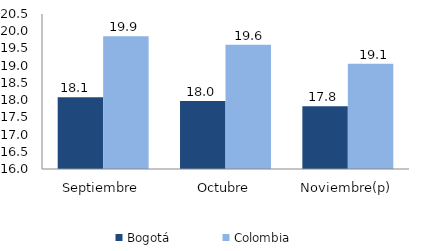
| Category | Bogotá | Colombia |
|---|---|---|
| Septiembre | 18.086 | 19.852 |
| Octubre | 17.977 | 19.604 |
| Noviembre(p) | 17.821 | 19.053 |